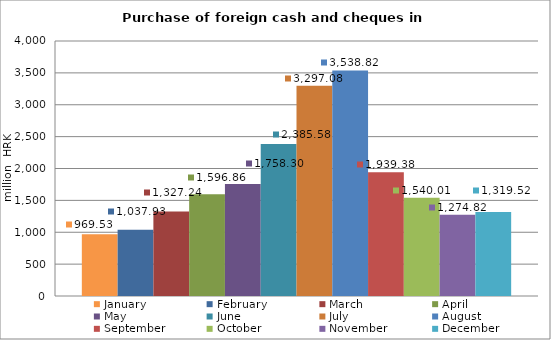
| Category | January | February | March | April | May | June | July | August | September | October | November | December |
|---|---|---|---|---|---|---|---|---|---|---|---|---|
| 0 | 969.532 | 1037.926 | 1327.244 | 1596.858 | 1758.303 | 2385.576 | 3297.079 | 3538.819 | 1939.379 | 1540.007 | 1274.822 | 1319.521 |